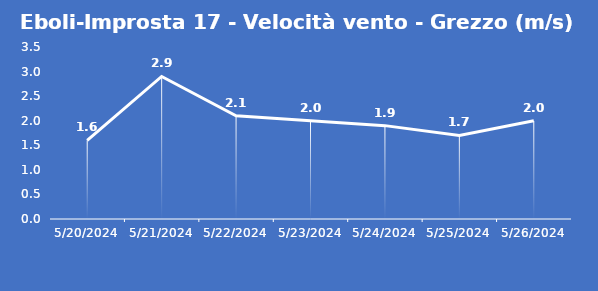
| Category | Eboli-Improsta 17 - Velocità vento - Grezzo (m/s) |
|---|---|
| 5/20/24 | 1.6 |
| 5/21/24 | 2.9 |
| 5/22/24 | 2.1 |
| 5/23/24 | 2 |
| 5/24/24 | 1.9 |
| 5/25/24 | 1.7 |
| 5/26/24 | 2 |